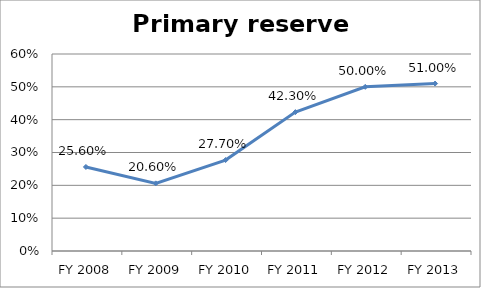
| Category | Primary reserve ratio |
|---|---|
| FY 2013 | 0.51 |
| FY 2012 | 0.5 |
| FY 2011 | 0.423 |
| FY 2010 | 0.277 |
| FY 2009 | 0.206 |
| FY 2008 | 0.256 |